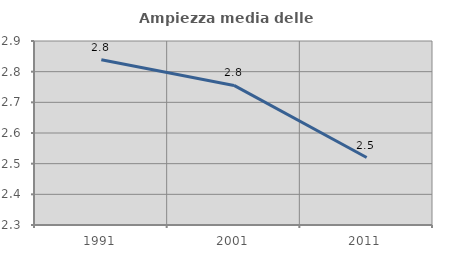
| Category | Ampiezza media delle famiglie |
|---|---|
| 1991.0 | 2.839 |
| 2001.0 | 2.755 |
| 2011.0 | 2.52 |